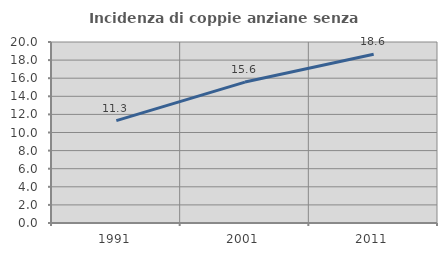
| Category | Incidenza di coppie anziane senza figli  |
|---|---|
| 1991.0 | 11.307 |
| 2001.0 | 15.571 |
| 2011.0 | 18.638 |